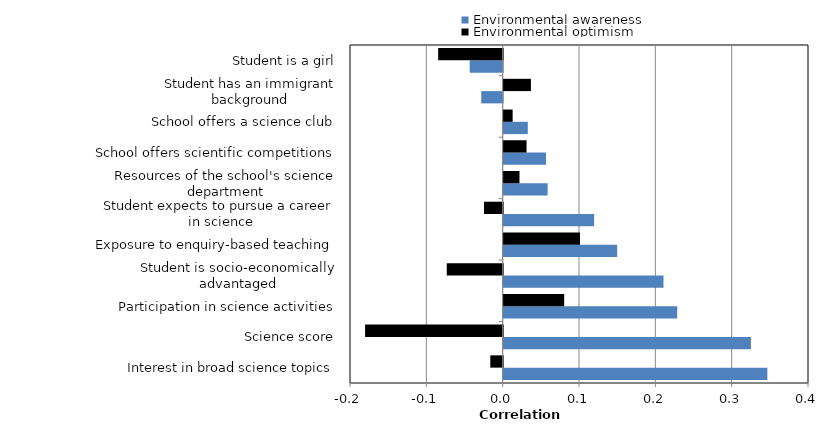
| Category | Environmental awareness | Environmental optimism |
|---|---|---|
| Interest in broad science topics | 0.345 | -0.016 |
| Science score | 0.324 | -0.18 |
| Participation in science activities | 0.227 | 0.079 |
| Student is socio-economically advantaged | 0.209 | -0.073 |
| Exposure to enquiry-based teaching | 0.149 | 0.1 |
| Student expects to pursue a career in science | 0.118 | -0.024 |
| Resources of the school's science department | 0.058 | 0.021 |
| School offers scientific competitions | 0.055 | 0.03 |
| School offers a science club | 0.032 | 0.012 |
| Student has an immigrant background | -0.028 | 0.036 |
| Student is a girl | -0.043 | -0.085 |